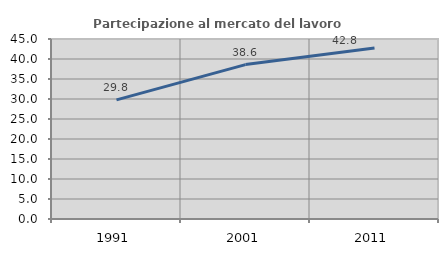
| Category | Partecipazione al mercato del lavoro  femminile |
|---|---|
| 1991.0 | 29.787 |
| 2001.0 | 38.604 |
| 2011.0 | 42.754 |